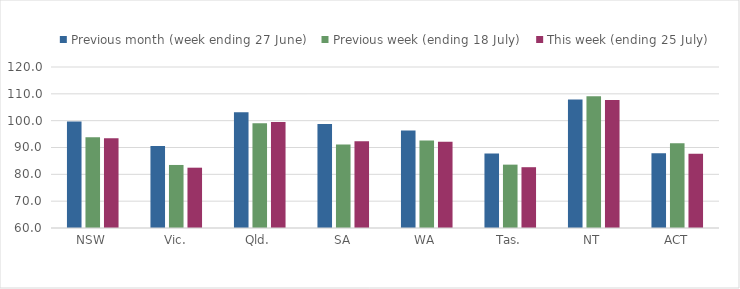
| Category | Previous month (week ending 27 June) | Previous week (ending 18 July) | This week (ending 25 July) |
|---|---|---|---|
| NSW | 99.716 | 93.853 | 93.426 |
| Vic. | 90.568 | 83.492 | 82.478 |
| Qld. | 103.138 | 99.03 | 99.511 |
| SA | 98.76 | 91.096 | 92.286 |
| WA | 96.309 | 92.577 | 92.141 |
| Tas. | 87.759 | 83.612 | 82.658 |
| NT | 107.848 | 109.114 | 107.681 |
| ACT | 87.85 | 91.589 | 87.701 |